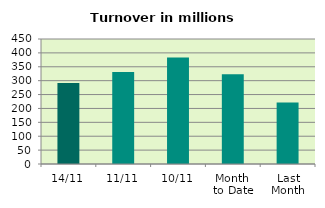
| Category | Series 0 |
|---|---|
| 14/11 | 291.828 |
| 11/11 | 331.119 |
| 10/11 | 383.62 |
| Month 
to Date | 322.84 |
| Last
Month | 221.516 |